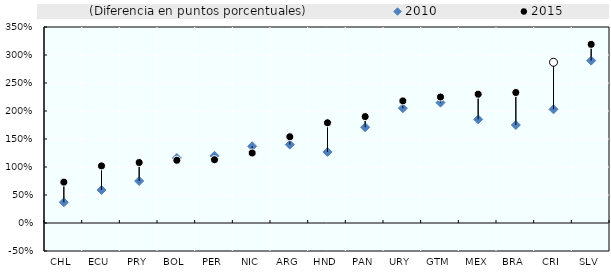
| Category | (Diferencia en puntos porcentuales) |
|---|---|
| CHL | 0.36 |
| ECU | 0.43 |
| PRY | 0.33 |
| BOL | -0.04 |
| PER | -0.07 |
| NIC | -0.12 |
| ARG | 0.14 |
| HND | 0.52 |
| PAN | 0.19 |
| URY | 0.13 |
| GTM | 0.1 |
| MEX | 0.45 |
| BRA | 0.58 |
| CRI | 0.84 |
| SLV | 0.29 |